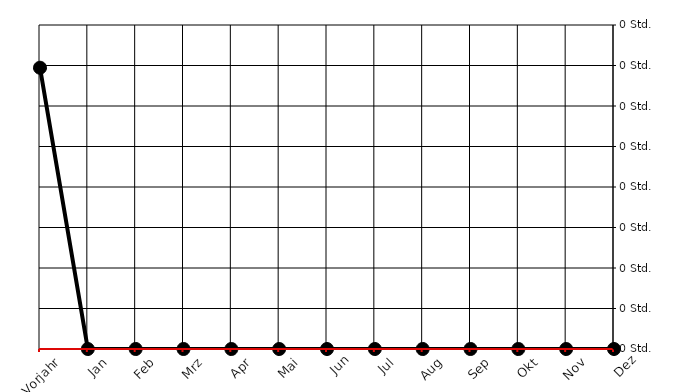
| Category | Series 0 |
|---|---|
| Vorjahr | 0.001 |
| Jan | 0 |
| Feb | 0 |
| Mrz | 0 |
| Apr | 0 |
| Mai | 0 |
| Jun | 0 |
| Jul | 0 |
| Aug | 0 |
| Sep | 0 |
| Okt | 0 |
| Nov | 0 |
| Dez | 0 |